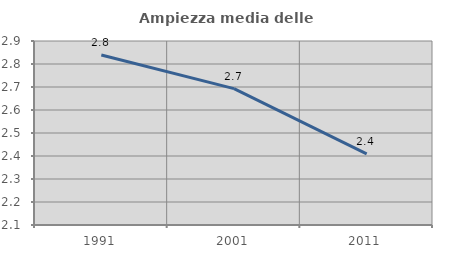
| Category | Ampiezza media delle famiglie |
|---|---|
| 1991.0 | 2.839 |
| 2001.0 | 2.693 |
| 2011.0 | 2.409 |